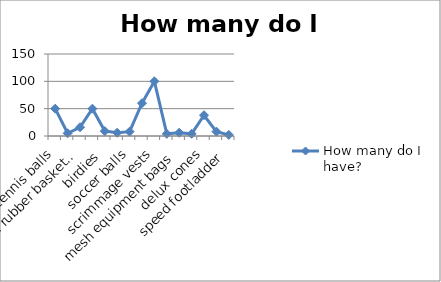
| Category | How many do I have? |
|---|---|
| tennis balls | 50 |
| colored rubber footballs | 5 |
| colored rubber basketballs | 16 |
| badminton racquets | 50 |
| birdies | 9 |
| volleyballs | 6 |
| soccer balls | 8 |
| tennis rackets | 60 |
| scrimmage vests | 100 |
| foal covered safety bats | 4 |
| mesh equipment bags | 6 |
| PVC Goal | 4 |
| delux cones | 38 |
| half cones | 8 |
| speed footladder | 2 |